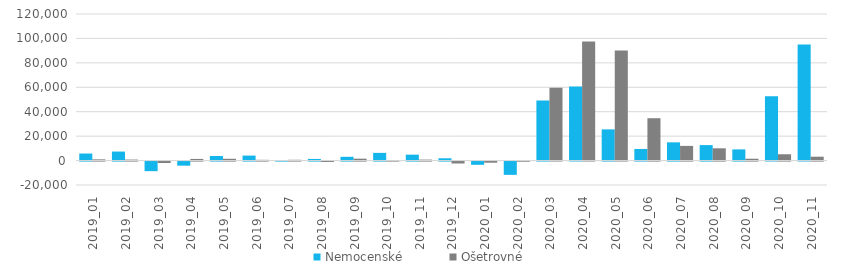
| Category | Nemocenské  | Ošetrovné |
|---|---|---|
| 2019_01 | 5771 | 991 |
| 2019_02 | 7377 | 801 |
| 2019_03 | -7833 | -1180 |
| 2019_04 | -3362 | 1324 |
| 2019_05 | 3761 | 1459 |
| 2019_06 | 4081 | 612 |
| 2019_07 | 100 | 643 |
| 2019_08 | 1350 | -323 |
| 2019_09 | 3082 | 1545 |
| 2019_10 | 6294 | 469 |
| 2019_11 | 4843 | 791 |
| 2019_12 | 1875 | -1567 |
| 2020_01 | -2656 | -932 |
| 2020_02 | -10882 | -115 |
| 2020_03 | 49183 | 59703 |
| 2020_04 | 60706 | 97507 |
| 2020_05 | 25546 | 90136 |
| 2020_06 | 9500 | 34669 |
| 2020_07 | 14930 | 12013 |
| 2020_08 | 12659 | 10039 |
| 2020_09 | 9149 | 1497 |
| 2020_10 | 52657 | 5171 |
| 2020_11 | 95099 | 3171 |